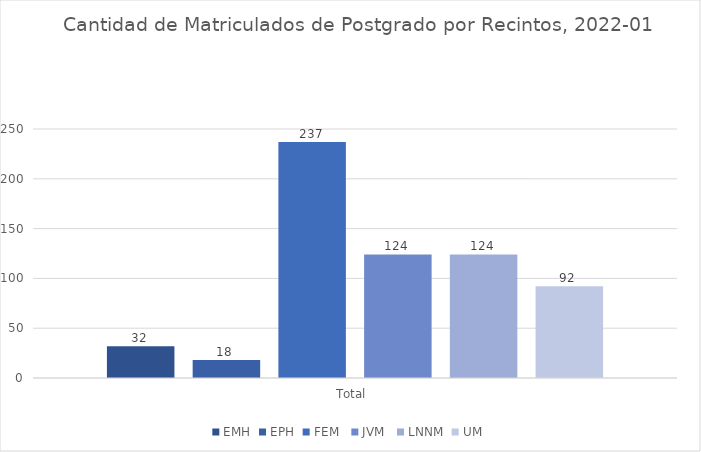
| Category | EMH | EPH | FEM  | JVM  | LNNM | UM |
|---|---|---|---|---|---|---|
| Total  | 32 | 18 | 237 | 124 | 124 | 92 |